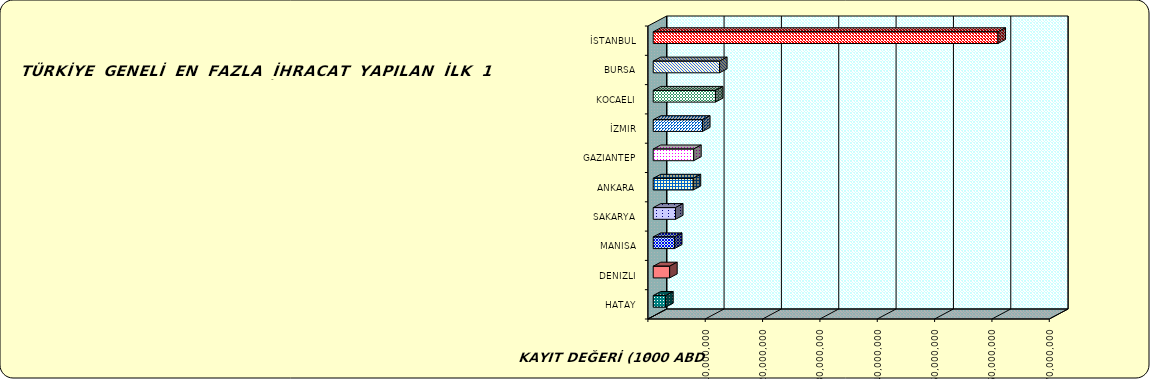
| Category | Series 0 |
|---|---|
| İSTANBUL | 60128483.823 |
| BURSA | 11569076.477 |
| KOCAELI | 10851867.054 |
| İZMIR | 8596730.147 |
| GAZIANTEP | 7051247.363 |
| ANKARA | 6971596.13 |
| SAKARYA | 3887641.219 |
| MANISA | 3703010.378 |
| DENIZLI | 2862737.892 |
| HATAY | 2165244.517 |